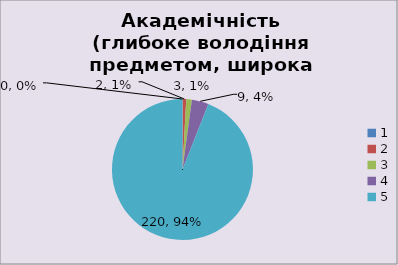
| Category | Кількість | % |
|---|---|---|
| 0 | 0 | 0 |
| 1 | 2 | 0.009 |
| 2 | 3 | 0.013 |
| 3 | 9 | 0.038 |
| 4 | 220 | 0.94 |